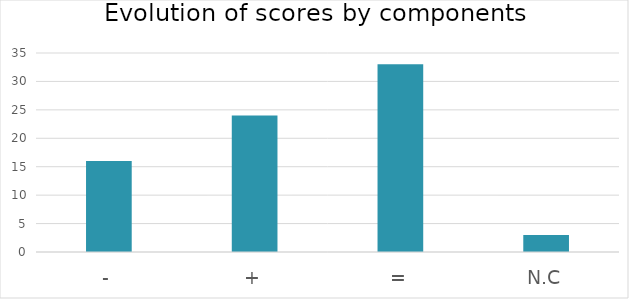
| Category | Evol |
|---|---|
| - | 16 |
| + | 24 |
| = | 33 |
| N.C | 3 |